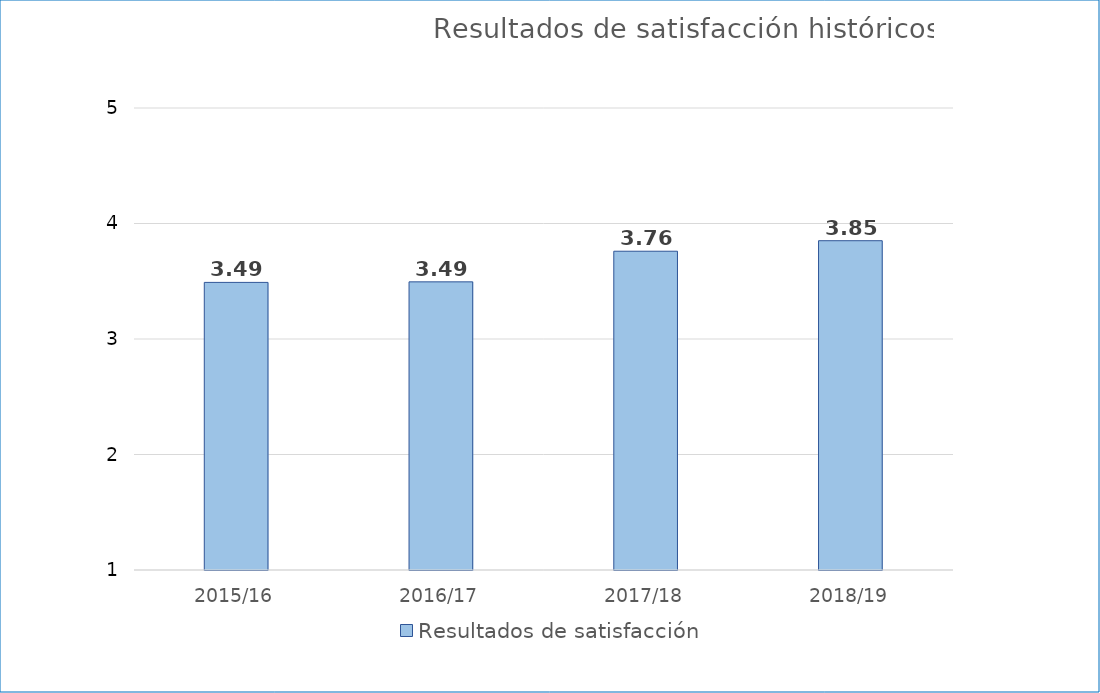
| Category | Resultados de satisfacción |
|---|---|
| 2015/16 | 3.49 |
| 2016/17 | 3.495 |
| 2017/18 | 3.76 |
| 2018/19 | 3.851 |